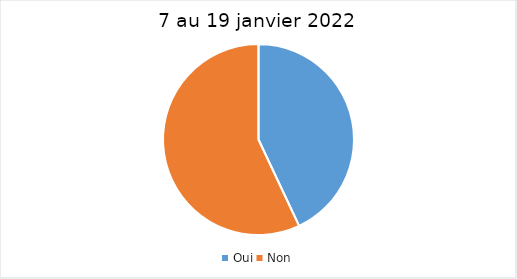
| Category | 7 au 19 janvier 2022 |
|---|---|
| Oui | 43 |
| Non | 57 |